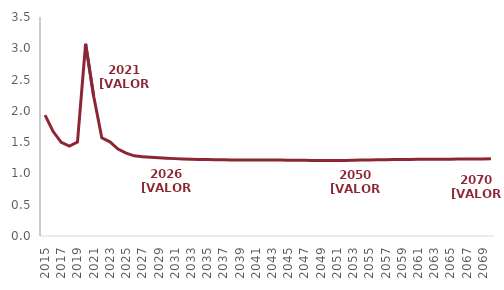
| Category | Desempleo |
|---|---|
| 2015.0 | 1.932 |
| 2016.0 | 1.669 |
| 2017.0 | 1.497 |
| 2018.0 | 1.437 |
| 2019.0 | 1.501 |
| 2020.0 | 3.071 |
| 2021.0 | 2.234 |
| 2022.0 | 1.57 |
| 2023.0 | 1.505 |
| 2024.0 | 1.39 |
| 2025.0 | 1.325 |
| 2026.0 | 1.281 |
| 2027.0 | 1.268 |
| 2028.0 | 1.258 |
| 2029.0 | 1.249 |
| 2030.0 | 1.242 |
| 2031.0 | 1.237 |
| 2032.0 | 1.232 |
| 2033.0 | 1.228 |
| 2034.0 | 1.225 |
| 2035.0 | 1.222 |
| 2036.0 | 1.219 |
| 2037.0 | 1.217 |
| 2038.0 | 1.216 |
| 2039.0 | 1.215 |
| 2040.0 | 1.214 |
| 2041.0 | 1.214 |
| 2042.0 | 1.214 |
| 2043.0 | 1.214 |
| 2044.0 | 1.213 |
| 2045.0 | 1.213 |
| 2046.0 | 1.211 |
| 2047.0 | 1.209 |
| 2048.0 | 1.206 |
| 2049.0 | 1.205 |
| 2050.0 | 1.205 |
| 2051.0 | 1.206 |
| 2052.0 | 1.208 |
| 2053.0 | 1.21 |
| 2054.0 | 1.213 |
| 2055.0 | 1.216 |
| 2056.0 | 1.218 |
| 2057.0 | 1.22 |
| 2058.0 | 1.222 |
| 2059.0 | 1.223 |
| 2060.0 | 1.224 |
| 2061.0 | 1.225 |
| 2062.0 | 1.226 |
| 2063.0 | 1.227 |
| 2064.0 | 1.227 |
| 2065.0 | 1.228 |
| 2066.0 | 1.229 |
| 2067.0 | 1.23 |
| 2068.0 | 1.231 |
| 2069.0 | 1.232 |
| 2070.0 | 1.233 |